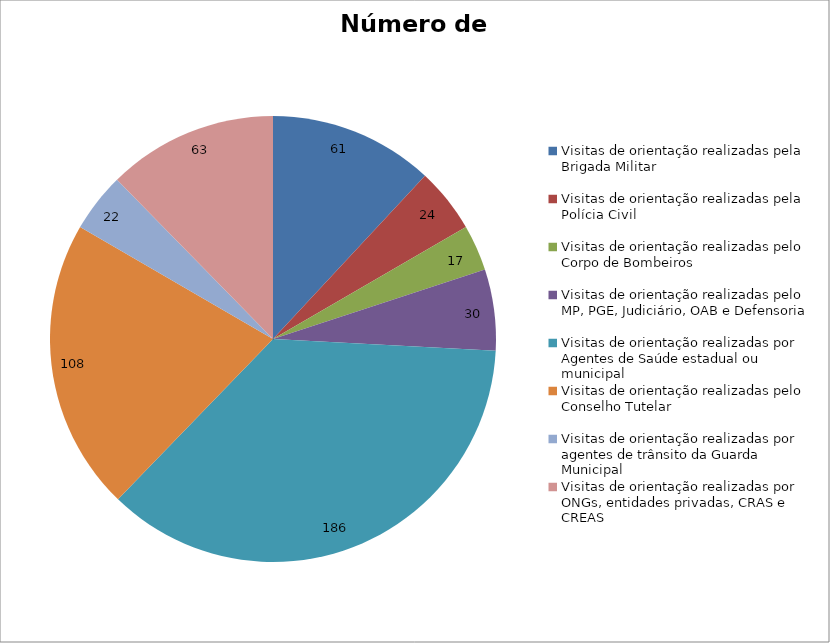
| Category | Número de Ações |
|---|---|
| Visitas de orientação realizadas pela Brigada Militar | 61 |
| Visitas de orientação realizadas pela Polícia Civil | 24 |
| Visitas de orientação realizadas pelo Corpo de Bombeiros | 17 |
| Visitas de orientação realizadas pelo MP, PGE, Judiciário, OAB e Defensoria | 30 |
| Visitas de orientação realizadas por Agentes de Saúde estadual ou municipal | 186 |
| Visitas de orientação realizadas pelo Conselho Tutelar | 108 |
| Visitas de orientação realizadas por agentes de trânsito da Guarda Municipal | 22 |
| Visitas de orientação realizadas por ONGs, entidades privadas, CRAS e CREAS | 63 |